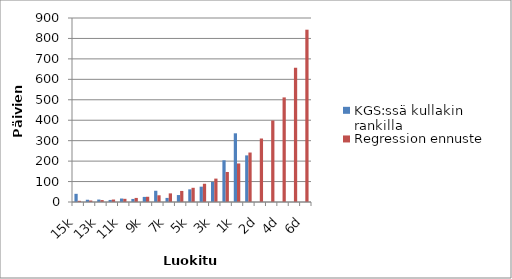
| Category | KGS:ssä kullakin rankilla | Regression ennuste |
|---|---|---|
| 15k | 40 | 5.728 |
| 14k | 11 | 7.352 |
| 13k | 12 | 9.436 |
| 12k | 10 | 12.111 |
| 11k | 17 | 15.544 |
| 10k | 15 | 19.95 |
| 9k | 25 | 25.605 |
| 8k | 55 | 32.863 |
| 7k | 20 | 42.178 |
| 6k | 34 | 54.135 |
| 5k | 62 | 69.48 |
| 4k | 75 | 89.176 |
| 3k | 98 | 114.454 |
| 2k | 204 | 146.899 |
| 1k | 336 | 188.54 |
| 1d | 228 | 241.985 |
| 2d | 0 | 310.58 |
| 3d | 0 | 398.62 |
| 4d | 0 | 511.617 |
| 5d | 0 | 656.644 |
| 6d | 0 | 842.782 |